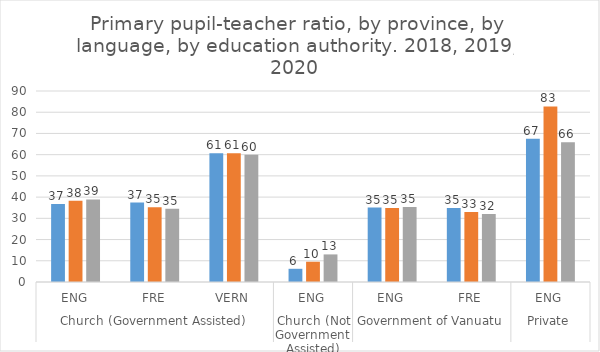
| Category | 2018 | 2019 | 2020 |
|---|---|---|---|
| 0 | 36.7 | 38.247 | 38.919 |
| 1 | 37.431 | 35.232 | 34.545 |
| 2 | 60.667 | 60.667 | 60 |
| 3 | 6.222 | 9.556 | 13 |
| 4 | 35.079 | 34.847 | 35.355 |
| 5 | 34.831 | 32.967 | 32.094 |
| 6 | 67.444 | 82.75 | 65.857 |